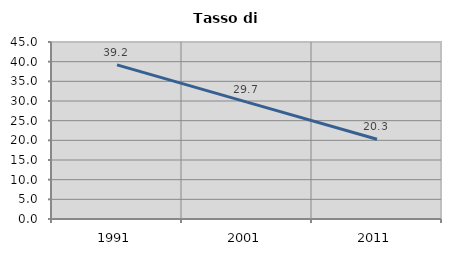
| Category | Tasso di disoccupazione   |
|---|---|
| 1991.0 | 39.17 |
| 2001.0 | 29.721 |
| 2011.0 | 20.283 |